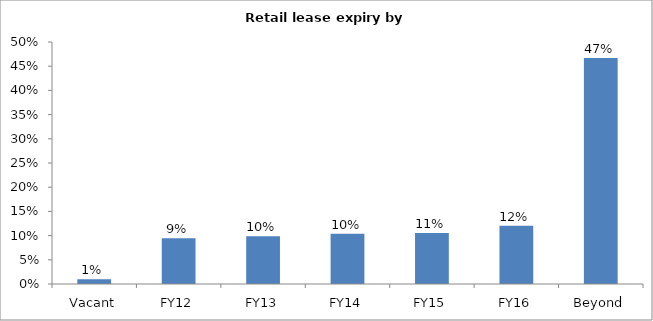
| Category | Series 0 |
|---|---|
| Vacant | 0.01 |
| FY12 | 0.094 |
| FY13 | 0.099 |
| FY14 | 0.104 |
| FY15 | 0.106 |
| FY16 | 0.12 |
| Beyond | 0.467 |